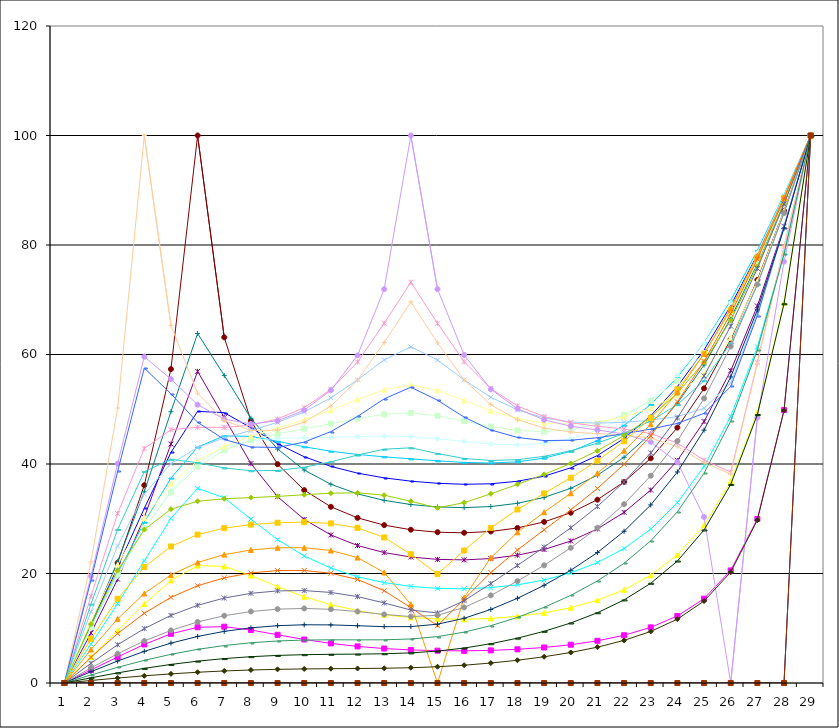
| Category | Series 0 | Series 1 | Series 2 | Series 3 | Series 4 | Series 5 | Series 6 | Series 7 | Series 8 | Series 9 | Series 10 | Series 11 | Series 12 | Series 13 | Series 14 | Series 15 | Series 16 | Series 17 | Series 18 | Series 19 | Series 20 | Series 21 | Series 22 | Series 23 | Series 24 | Series 25 | Series 26 | Series 27 | Series 28 |
|---|---|---|---|---|---|---|---|---|---|---|---|---|---|---|---|---|---|---|---|---|---|---|---|---|---|---|---|---|---|
| 0 | 0 | 0 | 0 | 0 | 0 | 0 | 0 | 0 | 0 | 0 | 0 | 0 | 0 | 0 | 0 | 0 | 0 | 0 | 0 | 0 | 0 | 0 | 0 | 0 | 0 | 0 | 0 | 0 | 0 |
| 1 | 0 | 2.383 | 4.773 | 7.099 | 9.13 | 10.467 | 10.801 | 10.525 | 10.133 | 9.973 | 10.271 | 11.22 | 13.029 | 15.875 | 19.519 | 22.131 | 18.794 | 14.399 | 10.752 | 8.06 | 6.115 | 4.688 | 3.606 | 2.755 | 2.059 | 1.467 | 0.944 | 0.462 | 0 |
| 2 | 0 | 4.759 | 9.612 | 14.493 | 18.953 | 21.937 | 22.212 | 21.166 | 20.033 | 19.486 | 19.893 | 21.579 | 25.021 | 30.951 | 40.072 | 50.212 | 38.644 | 28.051 | 20.549 | 15.372 | 11.714 | 9.03 | 6.981 | 5.354 | 4.014 | 2.867 | 1.847 | 0.905 | 0 |
| 3 | 0 | 7.042 | 14.422 | 22.307 | 30.254 | 36.116 | 34.945 | 31.894 | 29.348 | 28.047 | 28.235 | 30.184 | 34.524 | 42.839 | 59.604 | 100 | 57.521 | 38.612 | 28.02 | 21.167 | 16.338 | 12.737 | 9.933 | 7.668 | 5.775 | 4.138 | 2.672 | 1.311 | 0 |
| 4 | 0 | 8.986 | 18.726 | 30.058 | 43.641 | 57.328 | 49.557 | 42.119 | 37.418 | 35.117 | 34.817 | 36.398 | 40.053 | 46.275 | 55.506 | 65.314 | 52.827 | 40.857 | 31.751 | 24.94 | 19.735 | 15.646 | 12.346 | 9.611 | 7.281 | 5.239 | 3.392 | 1.667 | 0 |
| 5 | 0 | 10.178 | 21.439 | 35.559 | 56.922 | 100 | 63.835 | 49.607 | 43.087 | 40.188 | 39.518 | 40.538 | 43.014 | 46.702 | 50.832 | 52.924 | 47.618 | 40.236 | 33.187 | 27.107 | 22.015 | 17.767 | 14.195 | 11.149 | 8.5 | 6.144 | 3.99 | 1.964 | 0 |
| 6 | 0 | 10.287 | 21.291 | 33.817 | 48.49 | 63.139 | 56.179 | 49.386 | 45.137 | 43.031 | 42.529 | 43.224 | 44.764 | 46.688 | 48.195 | 47.934 | 44.484 | 39.285 | 33.653 | 28.285 | 23.453 | 19.211 | 15.518 | 12.288 | 9.428 | 6.846 | 4.46 | 2.2 | 0 |
| 7 | 0 | 9.679 | 19.623 | 29.928 | 40.083 | 47.886 | 48.354 | 46.622 | 45.043 | 44.272 | 44.342 | 45.065 | 46.132 | 47.091 | 47.326 | 46.133 | 43.101 | 38.765 | 33.857 | 28.929 | 24.299 | 20.108 | 16.377 | 13.058 | 10.077 | 7.351 | 4.806 | 2.376 | 0 |
| 8 | 0 | 8.806 | 17.594 | 26.188 | 34.028 | 39.969 | 42.731 | 43.706 | 44.141 | 44.673 | 45.502 | 46.564 | 47.608 | 48.219 | 47.884 | 46.171 | 43.021 | 38.817 | 34.083 | 29.274 | 24.707 | 20.546 | 16.824 | 13.492 | 10.47 | 7.676 | 5.038 | 2.496 | 0 |
| 9 | 0 | 7.95 | 15.76 | 23.202 | 29.874 | 35.23 | 38.897 | 41.329 | 43.145 | 44.778 | 46.428 | 48.082 | 49.516 | 50.294 | 49.823 | 47.645 | 43.997 | 39.401 | 34.382 | 29.378 | 24.708 | 20.546 | 16.882 | 13.616 | 10.635 | 7.844 | 5.173 | 2.571 | 0 |
| 10 | 0 | 7.232 | 14.296 | 20.986 | 27.037 | 32.182 | 36.297 | 39.571 | 42.331 | 44.865 | 47.353 | 49.821 | 52.082 | 53.618 | 53.467 | 50.591 | 45.922 | 40.406 | 34.668 | 29.148 | 24.202 | 20.047 | 16.541 | 13.456 | 10.611 | 7.894 | 5.239 | 2.614 | 0 |
| 11 | 0 | 6.683 | 13.208 | 19.407 | 25.107 | 30.165 | 34.537 | 38.329 | 41.742 | 45 | 48.298 | 51.766 | 55.373 | 58.631 | 59.839 | 55.328 | 48.696 | 41.634 | 34.737 | 28.344 | 22.906 | 18.899 | 15.78 | 13.055 | 10.46 | 7.88 | 5.276 | 2.646 | 0 |
| 12 | 0 | 6.291 | 12.446 | 18.329 | 23.82 | 28.834 | 33.358 | 37.467 | 41.311 | 45.096 | 49.075 | 53.574 | 59.013 | 65.694 | 71.929 | 62.186 | 51.901 | 42.697 | 34.302 | 26.585 | 20.179 | 16.864 | 14.624 | 12.525 | 10.294 | 7.889 | 5.34 | 2.694 | 0 |
| 13 | 0 | 6.037 | 11.955 | 17.644 | 23.009 | 27.995 | 32.595 | 36.869 | 40.94 | 44.997 | 49.332 | 54.444 | 61.411 | 73.202 | 100 | 69.586 | 54.023 | 42.953 | 33.19 | 23.516 | 14.362 | 13.754 | 13.325 | 12.129 | 10.301 | 8.042 | 5.501 | 2.791 | 0 |
| 14 | 0 | 5.902 | 11.696 | 17.281 | 22.58 | 27.542 | 32.16 | 36.476 | 40.582 | 44.623 | 48.813 | 53.46 | 58.985 | 65.704 | 71.937 | 62.134 | 51.655 | 41.902 | 31.989 | 19.927 | 0 | 10.466 | 12.794 | 12.366 | 10.74 | 8.476 | 5.833 | 2.968 | 0 |
| 15 | 0 | 5.876 | 11.644 | 17.207 | 22.487 | 27.433 | 32.029 | 36.295 | 40.289 | 44.1 | 47.838 | 51.6 | 55.367 | 58.692 | 59.911 | 55.359 | 48.561 | 41.011 | 32.938 | 24.202 | 15.606 | 15.314 | 15.019 | 13.802 | 11.818 | 9.288 | 6.386 | 3.25 | 0 |
| 16 | 0 | 5.957 | 11.798 | 17.417 | 22.729 | 27.676 | 32.227 | 36.386 | 40.181 | 43.653 | 46.84 | 49.734 | 52.191 | 53.786 | 53.656 | 50.83 | 46.219 | 40.643 | 34.55 | 28.337 | 22.907 | 20.168 | 18.165 | 16.004 | 13.441 | 10.472 | 7.173 | 3.645 | 0 |
| 17 | 0 | 6.155 | 12.174 | 17.935 | 23.338 | 28.313 | 32.82 | 36.844 | 40.395 | 43.49 | 46.137 | 48.307 | 49.88 | 50.604 | 50.1 | 48.085 | 44.845 | 40.792 | 36.283 | 31.689 | 27.518 | 24.285 | 21.471 | 18.61 | 15.47 | 11.987 | 8.189 | 4.157 | 0 |
| 18 | 0 | 6.488 | 12.808 | 18.811 | 24.376 | 29.421 | 33.895 | 37.776 | 41.066 | 43.776 | 45.914 | 47.476 | 48.418 | 48.652 | 48.056 | 46.565 | 44.285 | 41.397 | 38.102 | 34.619 | 31.193 | 27.982 | 24.823 | 21.493 | 17.843 | 13.818 | 9.44 | 4.793 | 0 |
| 19 | 0 | 6.989 | 13.76 | 20.124 | 25.936 | 31.1 | 35.562 | 39.302 | 42.32 | 44.633 | 46.269 | 47.264 | 47.667 | 47.53 | 46.907 | 45.836 | 44.333 | 42.411 | 40.108 | 37.493 | 34.653 | 31.628 | 28.347 | 24.697 | 20.592 | 16.001 | 10.961 | 5.575 | 0 |
| 20 | 0 | 7.708 | 15.12 | 21.99 | 28.145 | 33.482 | 37.954 | 41.549 | 44.279 | 46.168 | 47.264 | 47.648 | 47.455 | 46.895 | 46.206 | 45.54 | 44.801 | 43.808 | 42.425 | 40.593 | 38.299 | 35.531 | 32.24 | 28.357 | 23.826 | 18.633 | 12.829 | 6.547 | 0 |
| 21 | 0 | 8.723 | 17.023 | 24.572 | 31.171 | 36.729 | 41.222 | 44.664 | 47.078 | 48.498 | 48.973 | 48.607 | 47.614 | 46.388 | 45.484 | 45.318 | 45.523 | 45.595 | 45.193 | 44.155 | 42.42 | 39.957 | 36.725 | 32.665 | 27.722 | 21.875 | 15.174 | 7.784 | 0 |
| 22 | 0 | 10.161 | 19.676 | 28.104 | 35.24 | 41.041 | 45.543 | 48.806 | 50.874 | 51.774 | 51.525 | 50.194 | 48.006 | 45.558 | 44.025 | 44.725 | 46.38 | 47.856 | 48.597 | 48.414 | 47.268 | 45.153 | 42.038 | 37.857 | 32.524 | 25.971 | 18.209 | 9.414 | 0 |
| 23 | 0 | 12.245 | 23.416 | 32.93 | 40.645 | 46.652 | 51.105 | 54.142 | 55.838 | 56.198 | 55.16 | 52.637 | 48.66 | 43.815 | 40.334 | 43.177 | 47.416 | 50.851 | 52.927 | 53.636 | 53.087 | 51.349 | 48.416 | 44.2 | 38.547 | 31.276 | 22.276 | 11.664 | 0 |
| 24 | 0 | 15.405 | 28.813 | 39.554 | 47.76 | 53.816 | 58.085 | 60.82 | 62.14 | 62.021 | 60.281 | 56.534 | 50.181 | 40.709 | 30.319 | 40.235 | 49.256 | 55.208 | 58.622 | 60.119 | 60.095 | 58.74 | 56.078 | 51.982 | 46.186 | 38.31 | 27.954 | 14.966 | 0 |
| 25 | 0 | 20.56 | 36.877 | 48.712 | 57.026 | 62.767 | 66.598 | 68.913 | 69.88 | 69.467 | 67.407 | 63.04 | 54.819 | 38.522 | 0 | 38.186 | 54.165 | 62.102 | 66.234 | 68.122 | 68.433 | 67.44 | 65.175 | 61.463 | 55.906 | 47.826 | 36.264 | 20.247 | 0 |
| 26 | 0 | 29.96 | 49.423 | 61.392 | 68.867 | 73.627 | 76.629 | 78.354 | 78.999 | 78.561 | 76.84 | 73.401 | 67.535 | 58.559 | 48.463 | 58.344 | 67.117 | 72.801 | 76.091 | 77.702 | 78.074 | 77.411 | 75.717 | 72.792 | 68.147 | 60.823 | 49.028 | 29.758 | 0 |
| 27 | 0 | 49.855 | 69.462 | 78.569 | 83.42 | 86.246 | 87.937 | 88.873 | 89.203 | 88.939 | 87.992 | 86.188 | 83.36 | 79.717 | 76.948 | 79.612 | 83.156 | 85.896 | 87.627 | 88.52 | 88.752 | 88.414 | 87.492 | 85.838 | 83.069 | 78.29 | 69.269 | 49.757 | 0 |
| 28 | 100 | 100 | 100 | 100 | 100 | 100 | 100 | 100 | 100 | 100 | 100 | 100 | 100 | 100 | 100 | 100 | 100 | 100 | 100 | 100 | 100 | 100 | 100 | 100 | 100 | 100 | 100 | 100 | 100 |